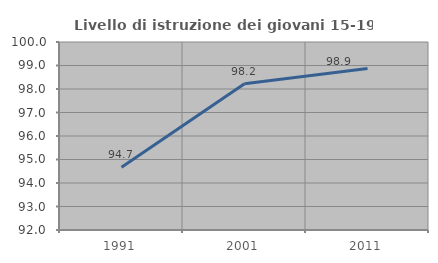
| Category | Livello di istruzione dei giovani 15-19 anni |
|---|---|
| 1991.0 | 94.667 |
| 2001.0 | 98.225 |
| 2011.0 | 98.876 |